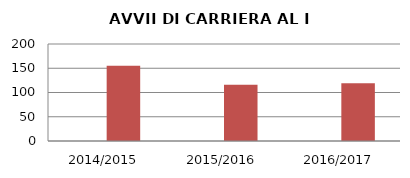
| Category | ANNO | NUMERO |
|---|---|---|
| 2014/2015 | 0 | 155 |
| 2015/2016 | 0 | 116 |
| 2016/2017 | 0 | 119 |